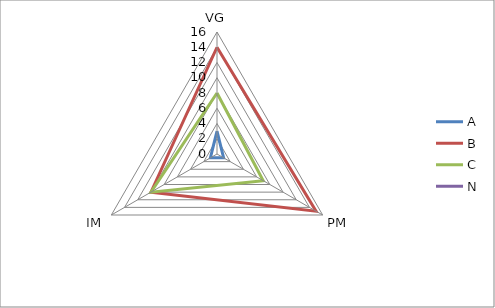
| Category | A | B | C | N |
|---|---|---|---|---|
| 0 | 3 | 14 | 8 | 0 |
| 1 | 1 | 15 | 7 | 0 |
| 2 | 1 | 10 | 10 | 0 |